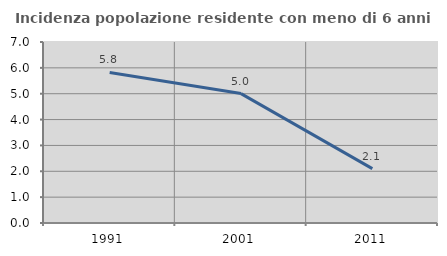
| Category | Incidenza popolazione residente con meno di 6 anni |
|---|---|
| 1991.0 | 5.823 |
| 2001.0 | 5.005 |
| 2011.0 | 2.104 |